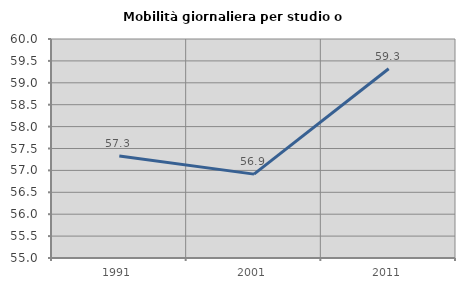
| Category | Mobilità giornaliera per studio o lavoro |
|---|---|
| 1991.0 | 57.331 |
| 2001.0 | 56.915 |
| 2011.0 | 59.32 |